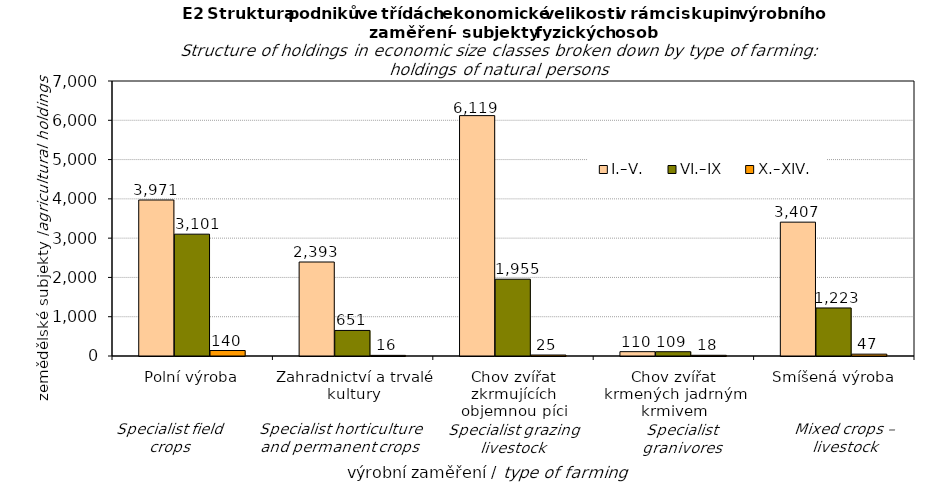
| Category | I.–V. | VI.–IX | X.–XIV. |
|---|---|---|---|
| Polní výroba | 3971.03 | 3101.09 | 140 |
| Zahradnictví a trvalé kultury | 2392.652 | 650.642 | 16 |
| Chov zvířat zkrmujících objemnou píci | 6118.722 | 1954.789 | 25 |
| Chov zvířat krmených jadrným krmivem | 110.354 | 109 | 18 |
| Smíšená výroba | 3407.274 | 1222.831 | 47 |